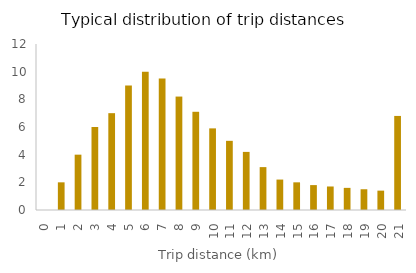
| Category | Proportion of trips |
|---|---|
| 0.0 | 0 |
| 1.0 | 2 |
| 2.0 | 4 |
| 3.0 | 6 |
| 4.0 | 7 |
| 5.0 | 9 |
| 6.0 | 10 |
| 7.0 | 9.5 |
| 8.0 | 8.2 |
| 9.0 | 7.1 |
| 10.0 | 5.9 |
| 11.0 | 5 |
| 12.0 | 4.2 |
| 13.0 | 3.1 |
| 14.0 | 2.2 |
| 15.0 | 2 |
| 16.0 | 1.8 |
| 17.0 | 1.7 |
| 18.0 | 1.6 |
| 19.0 | 1.5 |
| 20.0 | 1.4 |
| 21.0 | 6.8 |